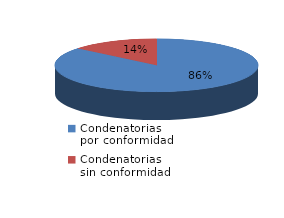
| Category | Series 0 |
|---|---|
| 0 | 350 |
| 1 | 57 |